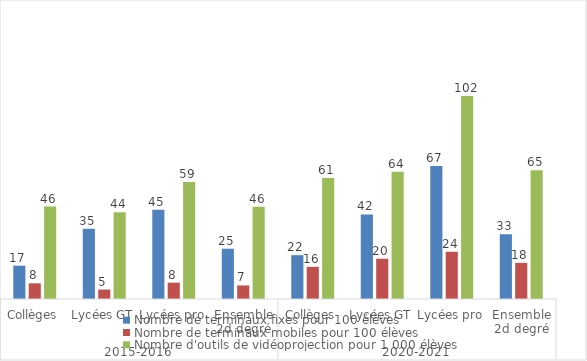
| Category | Nombre de terminaux fixes pour 100 élèves | Nombre de terminaux mobiles pour 100 élèves | Nombre d'outils de vidéoprojection pour 1 000 élèves |
|---|---|---|---|
| 0 | 16.737 | 7.864 | 46.415 |
| 1 | 35.233 | 4.74 | 43.536 |
| 2 | 44.845 | 8.215 | 58.712 |
| 3 | 25.241 | 6.803 | 46.317 |
| 4 | 22.005 | 16.146 | 60.778 |
| 5 | 42.483 | 20.217 | 63.909 |
| 6 | 66.839 | 23.732 | 101.961 |
| 7 | 32.518 | 18.149 | 64.644 |